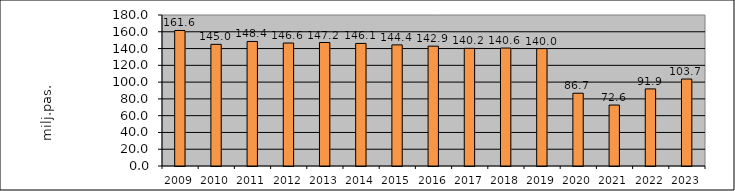
| Category | Series 1 |
|---|---|
| 2009.0 | 161.559 |
| 2010.0 | 145.021 |
| 2011.0 | 148.448 |
| 2012.0 | 146.587 |
| 2013.0 | 147.216 |
| 2014.0 | 146.114 |
| 2015.0 | 144.374 |
| 2016.0 | 142.871 |
| 2017.0 | 140.249 |
| 2018.0 | 140.583 |
| 2019.0 | 139.955 |
| 2020.0 | 86.725 |
| 2021.0 | 72.65 |
| 2022.0 | 91.886 |
| 2023.0 | 103.671 |